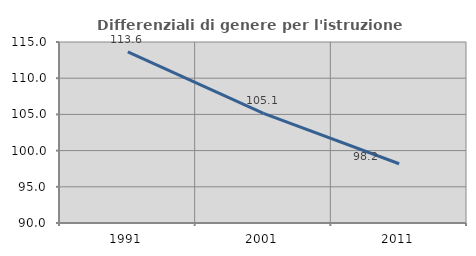
| Category | Differenziali di genere per l'istruzione superiore |
|---|---|
| 1991.0 | 113.639 |
| 2001.0 | 105.138 |
| 2011.0 | 98.184 |